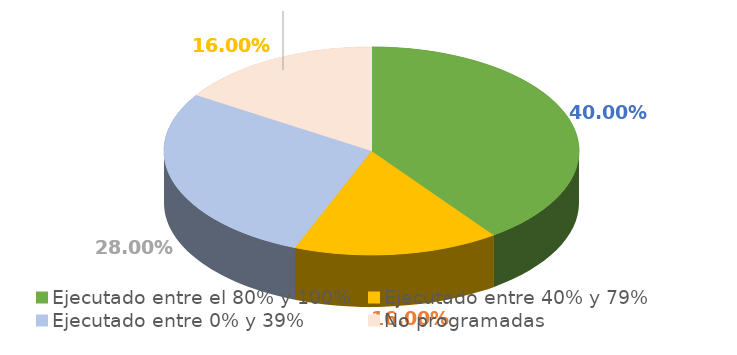
| Category | Series 0 |
|---|---|
| Ejecutado entre el 80% y 100% | 0.4 |
| Ejecutado entre 40% y 79% | 0.16 |
| Ejecutado entre 0% y 39% | 0.28 |
| No programadas | 0.16 |